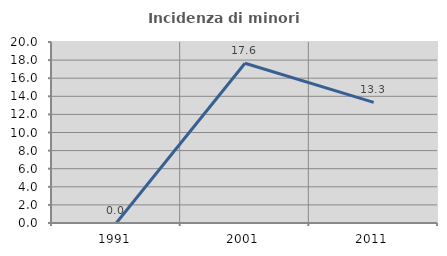
| Category | Incidenza di minori stranieri |
|---|---|
| 1991.0 | 0 |
| 2001.0 | 17.647 |
| 2011.0 | 13.333 |